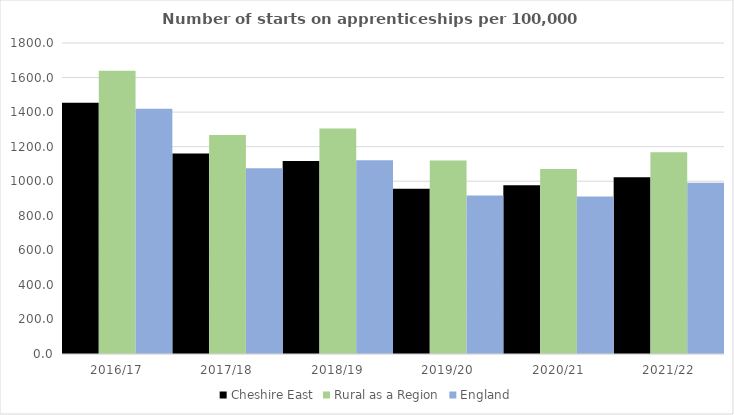
| Category | Cheshire East | Rural as a Region | England |
|---|---|---|---|
| 2016/17 | 1454 | 1638.789 | 1420 |
| 2017/18 | 1161 | 1267.474 | 1075 |
| 2018/19 | 1117 | 1304.57 | 1122 |
| 2019/20 | 956 | 1119.662 | 918 |
| 2020/21 | 976 | 1070.748 | 912 |
| 2021/22 | 1023 | 1167.68 | 991 |